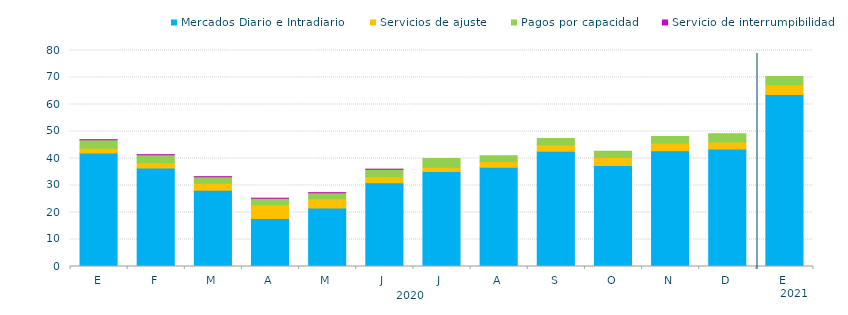
| Category | Mercados Diario e Intradiario  | Servicios de ajuste | Pagos por capacidad | Servicio de interrumpibilidad |
|---|---|---|---|---|
| E | 42.04 | 1.78 | 3.11 | 0.03 |
| F | 36.51 | 1.88 | 2.98 | 0.03 |
| M | 28.27 | 2.55 | 2.39 | 0.03 |
| A | 17.79 | 5.05 | 2.42 | 0.04 |
| M | 21.69 | 3.36 | 2.25 | 0.04 |
| J | 30.99 | 2.24 | 2.76 | 0.04 |
| J | 35.19 | 1.58 | 3.22 | 0 |
| A | 36.74 | 2.18 | 2.12 | 0 |
| S | 42.72 | 2.36 | 2.37 | 0 |
| O | 37.45 | 2.94 | 2.26 | 0 |
| N | 42.86 | 2.89 | 2.43 | 0 |
| D | 43.5 | 2.6 | 3.1 | 0 |
| E | 63.67 | 3.65 | 3.08 | 0 |